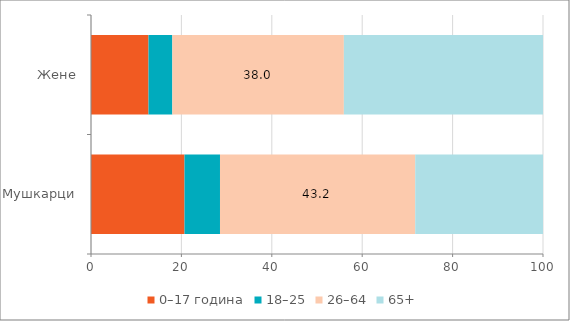
| Category | 0–17 година | 18–25 | 26–64 | 65+ |
|---|---|---|---|---|
| Мушкарци | 20.686 | 7.852 | 43.191 | 28.272 |
| Жене | 12.722 | 5.27 | 37.951 | 44.057 |